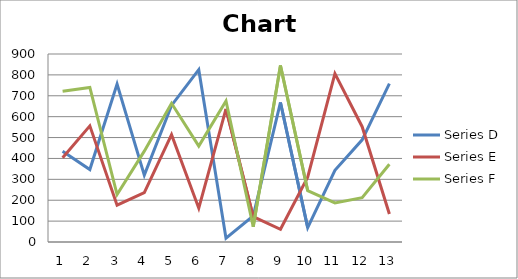
| Category | Series D | Series E | Series F |
|---|---|---|---|
| 0 | 435 | 403 | 722 |
| 1 | 347 | 556 | 740 |
| 2 | 756 | 176 | 227 |
| 3 | 320 | 236 | 435 |
| 4 | 654 | 514 | 664 |
| 5 | 825 | 162 | 459 |
| 6 | 18 | 637 | 675 |
| 7 | 125 | 121 | 73 |
| 8 | 668 | 61 | 845 |
| 9 | 69 | 310 | 246 |
| 10 | 343 | 806 | 187 |
| 11 | 489 | 552 | 212 |
| 12 | 758 | 134 | 372 |